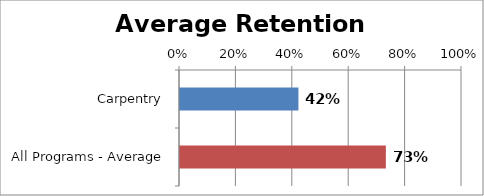
| Category | RetentionRate |
|---|---|
| Carpentry | 0.42 |
| All Programs - Average | 0.73 |